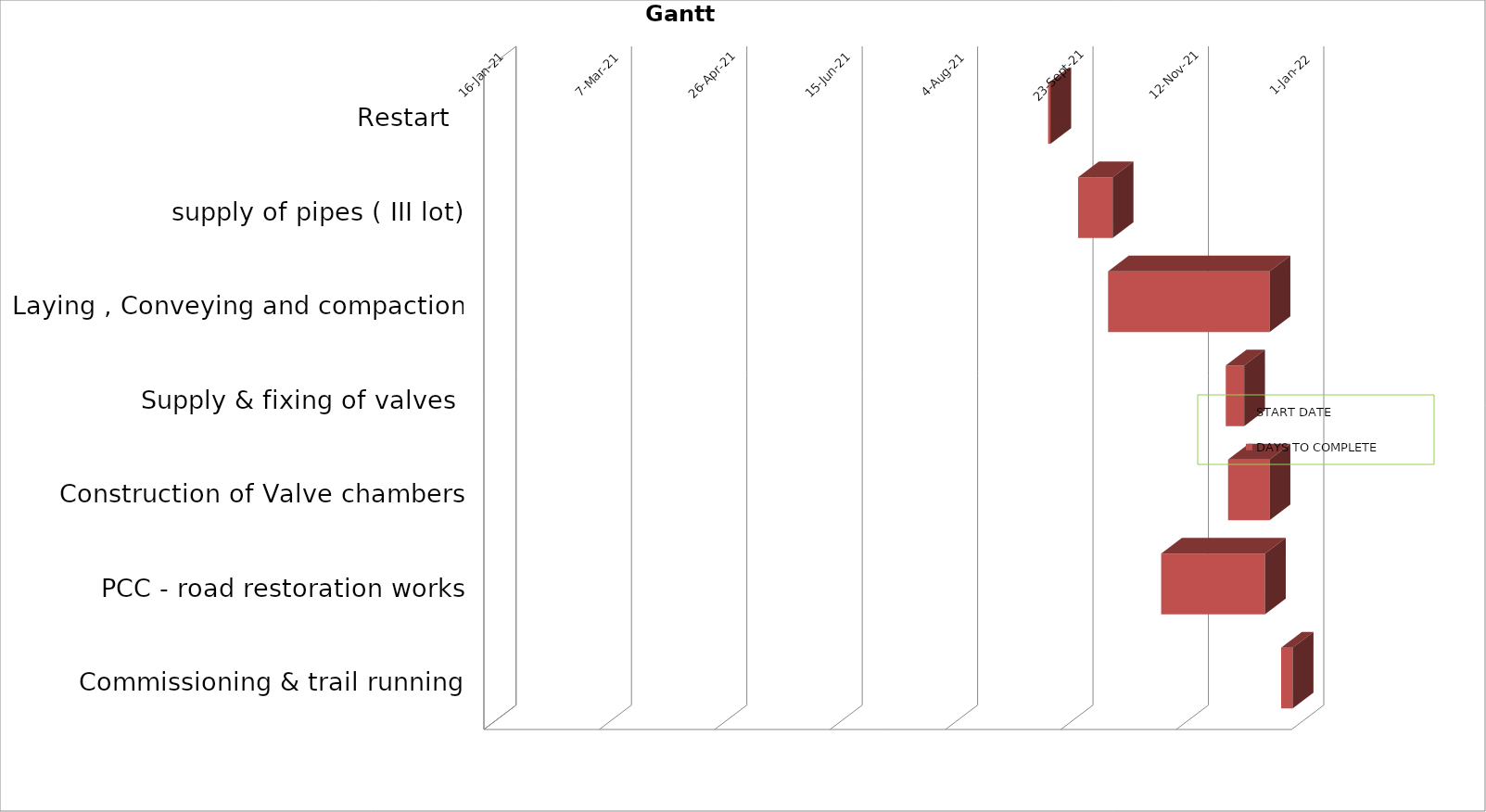
| Category | START DATE | DAYS TO COMPLETE |
|---|---|---|
| Restart  | 2021-09-15 | 1 |
| supply of pipes ( III lot) | 2021-09-28 | 15 |
| Laying , Conveying and compaction | 2021-10-11 | 70 |
| Supply & fixing of valves  | 2021-12-01 | 8 |
| Construction of Valve chambers | 2021-12-02 | 18 |
| PCC - road restoration works | 2021-11-03 | 45 |
| Commissioning & trail running | 2021-12-25 | 5 |